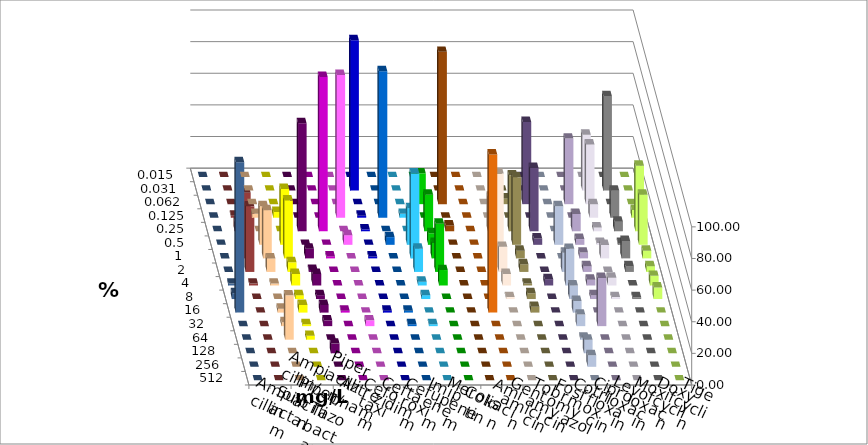
| Category | Ampicillin | Ampicillin/ Sulbactam | Piperacillin | Piperacillin/ Tazobactam | Aztreonam | Cefotaxim | Ceftazidim | Cefuroxim | Imipenem | Meropenem | Colistin | Amikacin | Gentamicin | Tobramycin | Fosfomycin | Cotrimoxazol | Ciprofloxacin | Levofloxacin | Moxifloxacin | Doxycyclin | Tigecyclin |
|---|---|---|---|---|---|---|---|---|---|---|---|---|---|---|---|---|---|---|---|---|---|
| 0.015 | 0 | 0 | 0 | 0 | 0 | 0 | 0 | 0 | 0 | 0 | 0 | 0 | 0 | 0 | 0 | 0 | 0 | 0 | 0 | 0 | 0 |
| 0.031 | 0 | 0 | 0 | 0 | 0 | 95.122 | 0 | 0 | 0 | 0 | 0 | 0 | 0 | 0 | 0 | 0 | 35.366 | 59.756 | 0 | 0 | 0 |
| 0.062 | 0 | 0 | 0 | 0 | 0 | 0 | 0 | 0 | 19.512 | 96.341 | 0 | 0 | 3.659 | 52 | 0 | 41.463 | 37.805 | 0 | 0 | 0 | 0 |
| 0.125 | 2.439 | 3.659 | 0 | 0 | 90.244 | 1.22 | 92.683 | 2.439 | 0 | 0 | 0 | 0 | 0 | 0 | 0 | 0 | 8.537 | 17.073 | 4.878 | 0 | 1.22 |
| 0.25 | 0 | 0 | 68.293 | 97.561 | 0 | 1.22 | 0 | 0 | 23.171 | 3.659 | 0 | 21.951 | 35.366 | 40 | 0 | 10.976 | 2.439 | 6.098 | 41.463 | 0 | 6.098 |
| 0.5 | 24.39 | 35.366 | 0 | 0 | 6.098 | 0 | 4.878 | 23.171 | 7.317 | 0 | 0 | 0 | 42.683 | 4 | 24.39 | 3.659 | 1.22 | 1.22 | 31.707 | 0 | 8.537 |
| 1.0 | 30.488 | 36.585 | 6.098 | 1.22 | 0 | 1.22 | 0 | 53.659 | 9.756 | 0 | 0 | 53.659 | 4.878 | 0 | 0 | 3.659 | 8.537 | 10.976 | 4.878 | 0 | 41.463 |
| 2.0 | 8.537 | 6.098 | 1.22 | 0 | 0 | 0 | 0 | 14.634 | 30.488 | 0 | 0 | 15.854 | 4.878 | 0 | 12.195 | 3.659 | 0 | 3.659 | 3.659 | 0 | 41.463 |
| 4.0 | 1.22 | 7.317 | 7.317 | 0 | 0 | 0 | 0 | 2.439 | 9.756 | 0 | 0 | 7.317 | 1.22 | 4 | 23.171 | 3.659 | 4.878 | 0 | 6.098 | 1.22 | 1.22 |
| 8.0 | 0 | 2.439 | 2.439 | 0 | 0 | 0 | 0 | 2.439 | 0 | 0 | 0 | 1.22 | 3.659 | 0 | 8.537 | 2.439 | 1.22 | 1.22 | 7.317 | 3.659 | 0 |
| 16.0 | 2.439 | 4.878 | 4.878 | 1.22 | 0 | 1.22 | 1.22 | 0 | 0 | 0 | 100 | 0 | 3.659 | 0 | 7.317 | 0 | 0 | 0 | 0 | 95.122 | 0 |
| 32.0 | 2.439 | 1.22 | 3.659 | 0 | 3.659 | 0 | 1.22 | 1.22 | 0 | 0 | 0 | 0 | 0 | 0 | 7.317 | 30.488 | 0 | 0 | 0 | 0 | 0 |
| 64.0 | 28.049 | 2.439 | 0 | 0 | 0 | 0 | 0 | 0 | 0 | 0 | 0 | 0 | 0 | 0 | 1.22 | 0 | 0 | 0 | 0 | 0 | 0 |
| 128.0 | 0 | 0 | 6.098 | 0 | 0 | 0 | 0 | 0 | 0 | 0 | 0 | 0 | 0 | 0 | 8.537 | 0 | 0 | 0 | 0 | 0 | 0 |
| 256.0 | 0 | 0 | 0 | 0 | 0 | 0 | 0 | 0 | 0 | 0 | 0 | 0 | 0 | 0 | 7.317 | 0 | 0 | 0 | 0 | 0 | 0 |
| 512.0 | 0 | 0 | 0 | 0 | 0 | 0 | 0 | 0 | 0 | 0 | 0 | 0 | 0 | 0 | 0 | 0 | 0 | 0 | 0 | 0 | 0 |